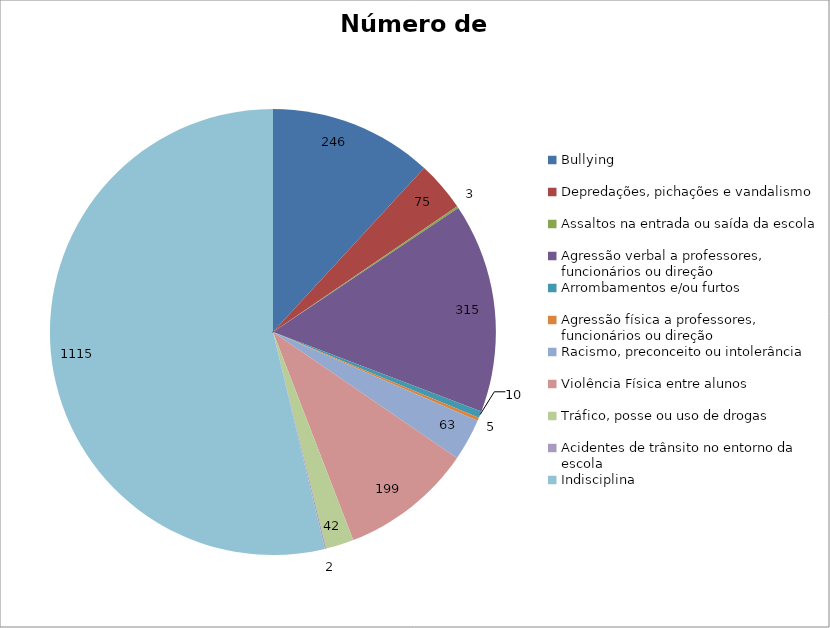
| Category | Número de Casos |
|---|---|
| Bullying | 246 |
| Depredações, pichações e vandalismo | 75 |
| Assaltos na entrada ou saída da escola | 3 |
| Agressão verbal a professores, funcionários ou direção | 315 |
| Arrombamentos e/ou furtos | 10 |
| Agressão física a professores, funcionários ou direção | 5 |
| Racismo, preconceito ou intolerância | 63 |
| Violência Física entre alunos | 199 |
| Tráfico, posse ou uso de drogas | 42 |
| Acidentes de trânsito no entorno da escola | 2 |
| Indisciplina | 1115 |